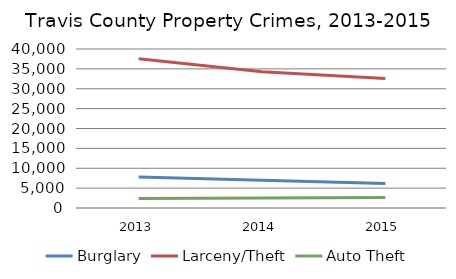
| Category | Burglary | Larceny/Theft | Auto Theft |
|---|---|---|---|
| 2013.0 | 7768 | 37551 | 2396 |
| 2014.0 | 6972 | 34267 | 2534 |
| 2015.0 | 6154 | 32558 | 2614 |